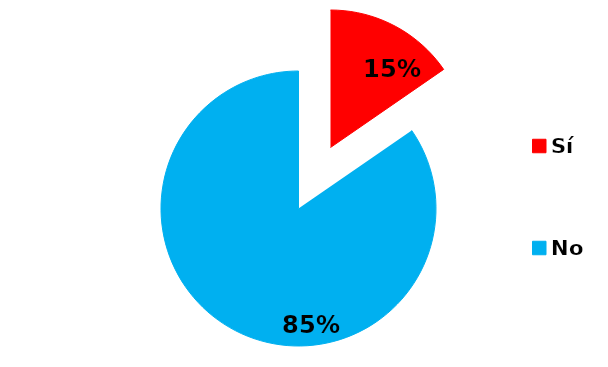
| Category | Series 0 |
|---|---|
| Sí | 2 |
| No | 11 |